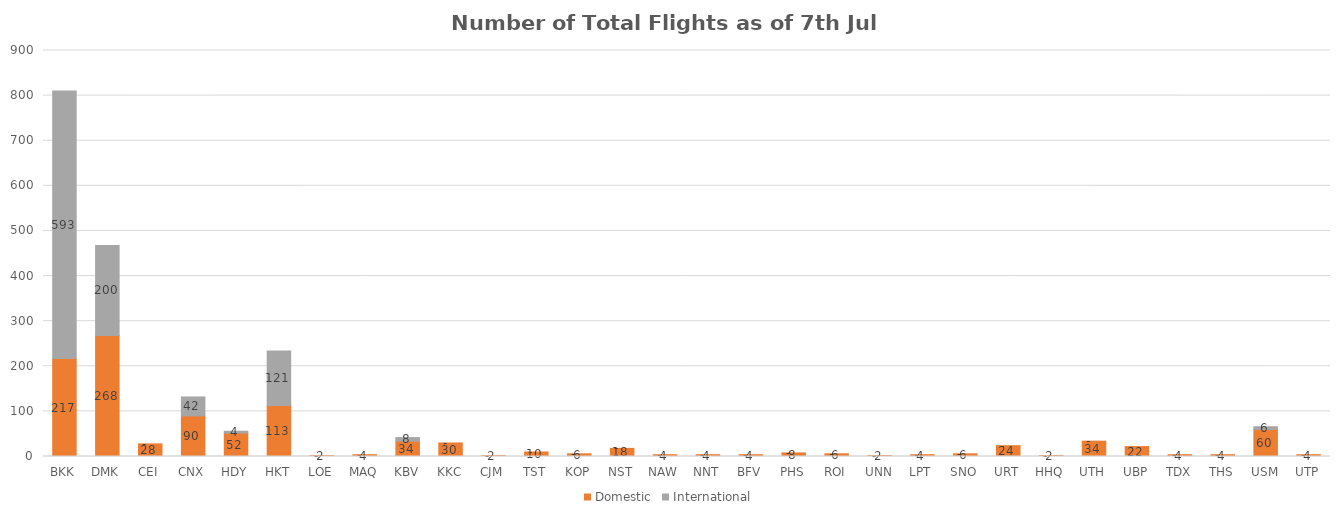
| Category | Domestic | International |
|---|---|---|
| BKK | 217 | 593 |
| DMK | 268 | 200 |
| CEI | 28 | 0 |
| CNX | 90 | 42 |
| HDY | 52 | 4 |
| HKT | 113 | 121 |
| LOE | 2 | 0 |
| MAQ | 4 | 0 |
| KBV | 34 | 8 |
| KKC | 30 | 0 |
| CJM | 2 | 0 |
| TST | 10 | 0 |
| KOP | 6 | 0 |
| NST | 18 | 0 |
| NAW | 4 | 0 |
| NNT | 4 | 0 |
| BFV | 4 | 0 |
| PHS | 8 | 0 |
| ROI | 6 | 0 |
| UNN | 2 | 0 |
| LPT | 4 | 0 |
| SNO | 6 | 0 |
| URT | 24 | 0 |
| HHQ | 2 | 0 |
| UTH | 34 | 0 |
| UBP | 22 | 0 |
| TDX | 4 | 0 |
| THS | 4 | 0 |
| USM | 60 | 6 |
| UTP | 4 | 0 |